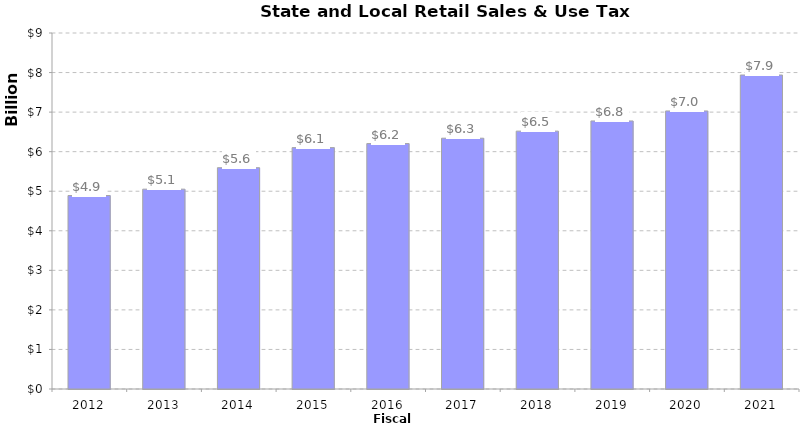
| Category | Series 0 |
|---|---|
| 2012.0 | 4891193000 |
| 2013.0 | 5052117000 |
| 2014.0 | 5594644000 |
| 2015.0 | 6102277000 |
| 2016.0 | 6204518000 |
| 2017.0 | 6340303000 |
| 2018.0 | 6519121000 |
| 2019.0 | 6776640000 |
| 2020.0 | 7029640000 |
| 2021.0 | 7937850000 |